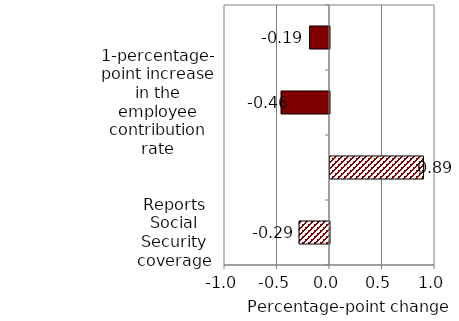
| Category | Series 0 |
|---|---|
| Reports Social Security coverage | -0.29 |
| Pension's funded ratio in bottom third  | 0.89 |
| 1-percentage-point increase in the employee contribution rate | -0.46 |
| 1-percentage-point increase in the employer contribution rate | -0.19 |